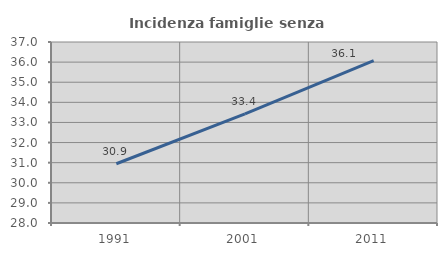
| Category | Incidenza famiglie senza nuclei |
|---|---|
| 1991.0 | 30.946 |
| 2001.0 | 33.425 |
| 2011.0 | 36.07 |